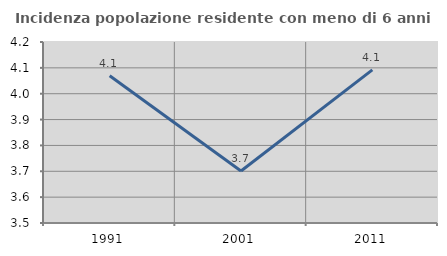
| Category | Incidenza popolazione residente con meno di 6 anni |
|---|---|
| 1991.0 | 4.07 |
| 2001.0 | 3.701 |
| 2011.0 | 4.092 |